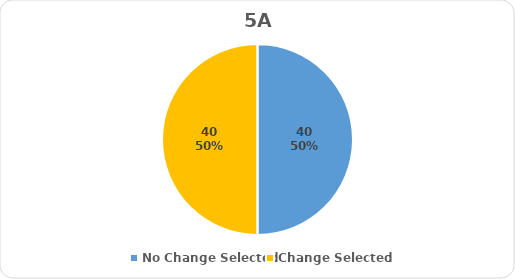
| Category | Series 0 |
|---|---|
| No Change Selected | 40 |
| Change Selected | 40 |